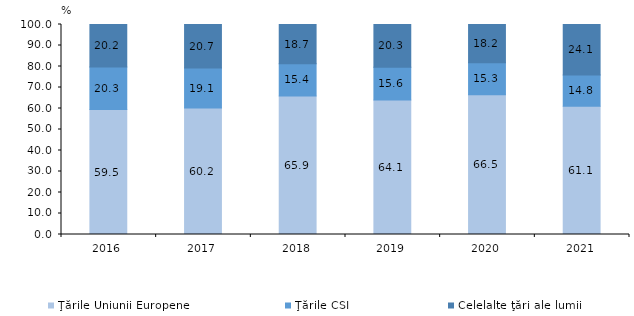
| Category | Ţările Uniunii Europene  | Ţările CSI  | Celelalte ţări ale lumii  |
|---|---|---|---|
| 2016.0 | 59.5 | 20.3 | 20.2 |
| 2017.0 | 60.2 | 19.1 | 20.7 |
| 2018.0 | 65.9 | 15.4 | 18.7 |
| 2019.0 | 64.1 | 15.6 | 20.3 |
| 2020.0 | 66.5 | 15.3 | 18.2 |
| 2021.0 | 61.1 | 14.8 | 24.1 |